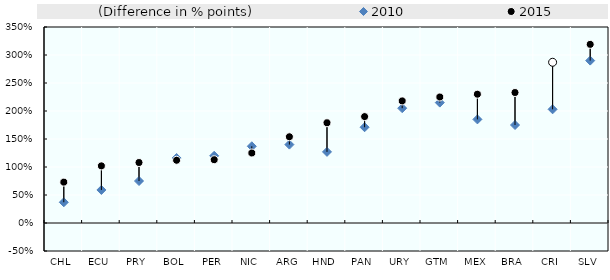
| Category | (Difference in % points) |
|---|---|
| CHL | 0.36 |
| ECU | 0.43 |
| PRY | 0.33 |
| BOL | -0.04 |
| PER | -0.07 |
| NIC | -0.12 |
| ARG | 0.14 |
| HND | 0.52 |
| PAN | 0.19 |
| URY | 0.13 |
| GTM | 0.1 |
| MEX | 0.45 |
| BRA | 0.58 |
| CRI | 0.84 |
| SLV | 0.29 |